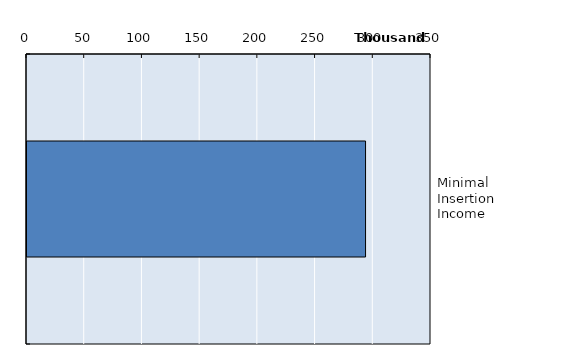
| Category | Series 0 |
|---|---|
| Minimal Insertion Income | 293302 |